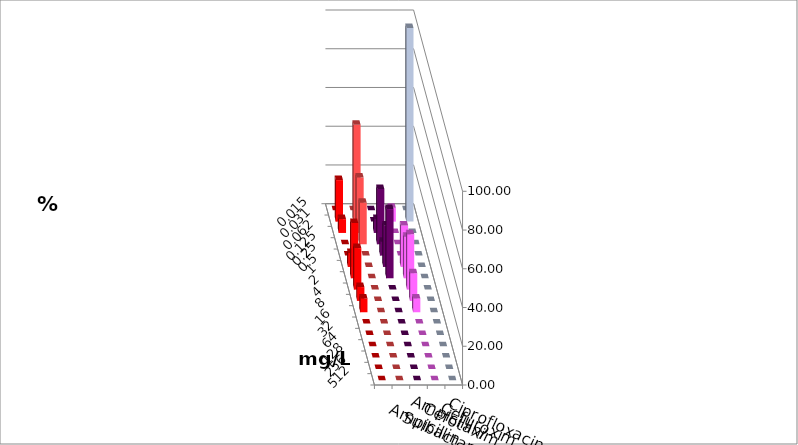
| Category | Ampicillin | Ampicillin/ Sulbactam | Cefotaxim | Cefuroxim | Ciprofloxacin |
|---|---|---|---|---|---|
| 0.015 | 0 | 0 | 0 | 0 | 0 |
| 0.031 | 21.429 | 50 | 0 | 7.143 | 100 |
| 0.062 | 7.143 | 28.571 | 7.143 | 0 | 0 |
| 0.125 | 0 | 21.429 | 28.571 | 0 | 0 |
| 0.25 | 0 | 0 | 7.143 | 0 | 0 |
| 0.5 | 7.143 | 0 | 21.429 | 21.429 | 0 |
| 1.0 | 28.571 | 0 | 35.714 | 21.429 | 0 |
| 2.0 | 21.429 | 0 | 0 | 28.571 | 0 |
| 4.0 | 7.143 | 0 | 0 | 14.286 | 0 |
| 8.0 | 7.143 | 0 | 0 | 7.143 | 0 |
| 16.0 | 0 | 0 | 0 | 0 | 0 |
| 32.0 | 0 | 0 | 0 | 0 | 0 |
| 64.0 | 0 | 0 | 0 | 0 | 0 |
| 128.0 | 0 | 0 | 0 | 0 | 0 |
| 256.0 | 0 | 0 | 0 | 0 | 0 |
| 512.0 | 0 | 0 | 0 | 0 | 0 |